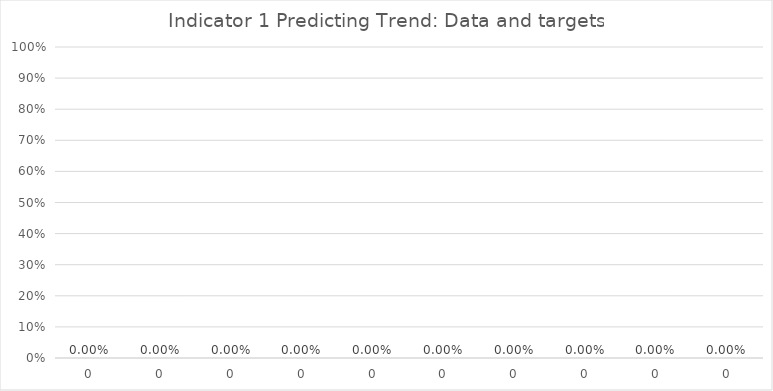
| Category | Indicator 1 data and targets |
|---|---|
| 0.0 | 0 |
| 0.0 | 0 |
| 0.0 | 0 |
| 0.0 | 0 |
| 0.0 | 0 |
| 0.0 | 0 |
| 0.0 | 0 |
| 0.0 | 0 |
| 0.0 | 0 |
| 0.0 | 0 |